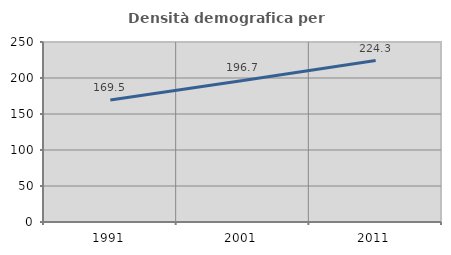
| Category | Densità demografica |
|---|---|
| 1991.0 | 169.549 |
| 2001.0 | 196.677 |
| 2011.0 | 224.259 |